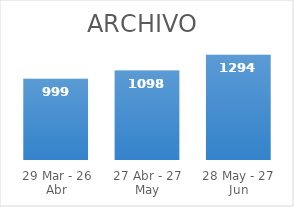
| Category | Series 0 |
|---|---|
| 29 Mar - 26 Abr | 999 |
| 27 Abr - 27 May | 1098 |
| 28 May - 27 Jun | 1294 |